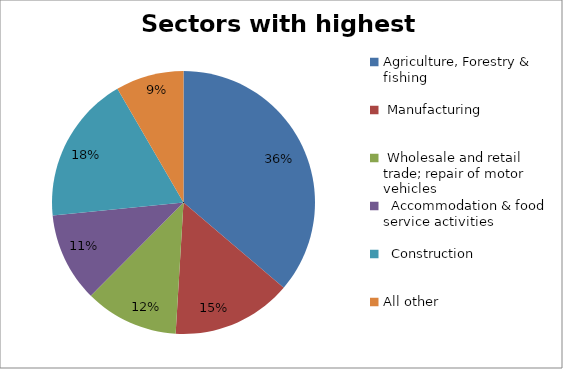
| Category | Sectors with highest totals | Percentage |
|---|---|---|
| Agriculture, Forestry & fishing | 36984 | 0.362 |
|  Manufacturing | 15057 | 0.147 |
|  Wholesale and retail trade; repair of motor vehicles  | 11742 | 0.115 |
|   Accommodation & food service activities | 11206 | 0.11 |
|   Construction | 18589 | 0.182 |
| All other | 8559 | 0.084 |